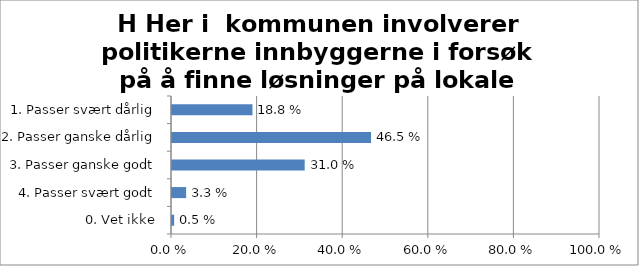
| Category | H Her i  kommunen involverer politikerne innbyggerne i forsøk på å finne løsninger på lokale problemer |
|---|---|
| 1. Passer svært dårlig | 0.188 |
| 2. Passer ganske dårlig | 0.465 |
| 3. Passer ganske godt | 0.31 |
| 4. Passer svært godt | 0.033 |
| 0. Vet ikke | 0.005 |